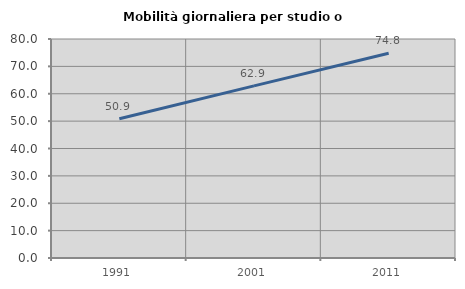
| Category | Mobilità giornaliera per studio o lavoro |
|---|---|
| 1991.0 | 50.853 |
| 2001.0 | 62.867 |
| 2011.0 | 74.775 |